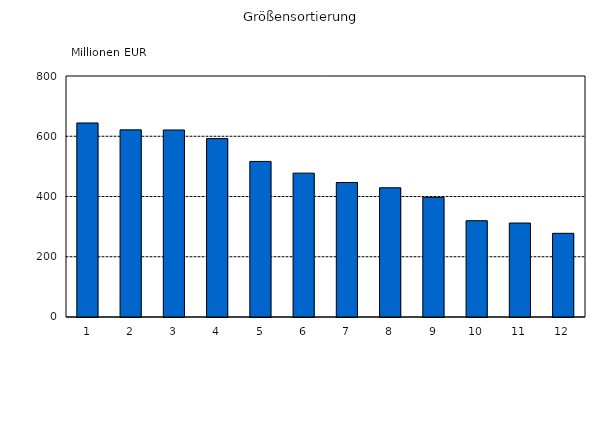
| Category | Series 0 |
|---|---|
| 1 | 644.062 |
| 2 | 621.265 |
| 3 | 620.771 |
| 4 | 592.124 |
| 5 | 516.415 |
| 6 | 477.587 |
| 7 | 446.513 |
| 8 | 428.901 |
| 9 | 397.378 |
| 10 | 319.652 |
| 11 | 311.88 |
| 12 | 277.8 |